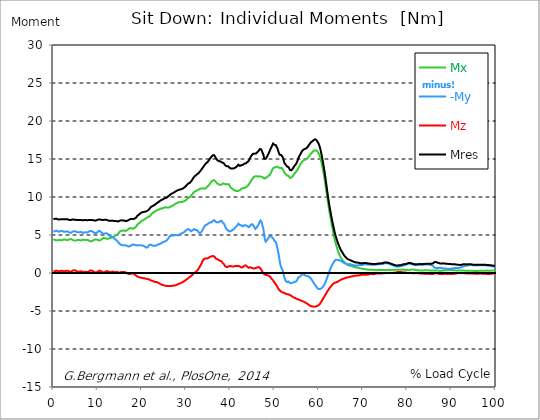
| Category |  Mx |  -My |  Mz |  Mres |
|---|---|---|---|---|
| 0.0 | 4.44 | 5.42 | 0.22 | 7.09 |
| 0.167348456675344 | 4.39 | 5.46 | 0.23 | 7.09 |
| 0.334696913350688 | 4.36 | 5.5 | 0.25 | 7.12 |
| 0.5020453700260321 | 4.33 | 5.54 | 0.29 | 7.14 |
| 0.669393826701376 | 4.29 | 5.58 | 0.32 | 7.15 |
| 0.83674228337672 | 4.29 | 5.53 | 0.3 | 7.09 |
| 1.0040907400520642 | 4.31 | 5.47 | 0.25 | 7.06 |
| 1.1621420602454444 | 4.36 | 5.43 | 0.2 | 7.04 |
| 1.3294905169207885 | 4.35 | 5.44 | 0.21 | 7.04 |
| 1.4968389735961325 | 4.33 | 5.47 | 0.23 | 7.05 |
| 1.6641874302714765 | 4.32 | 5.51 | 0.28 | 7.08 |
| 1.8315358869468206 | 4.29 | 5.54 | 0.33 | 7.1 |
| 1.9988843436221646 | 4.32 | 5.51 | 0.3 | 7.08 |
| 2.1662328002975086 | 4.36 | 5.46 | 0.27 | 7.07 |
| 2.333581256972853 | 4.41 | 5.43 | 0.22 | 7.07 |
| 2.5009297136481967 | 4.42 | 5.42 | 0.22 | 7.07 |
| 2.6682781703235405 | 4.4 | 5.43 | 0.24 | 7.07 |
| 2.8356266269988843 | 4.36 | 5.47 | 0.29 | 7.08 |
| 3.002975083674229 | 4.34 | 5.49 | 0.31 | 7.08 |
| 3.1703235403495724 | 4.34 | 5.47 | 0.31 | 7.07 |
| 3.337671997024917 | 4.34 | 5.44 | 0.29 | 7.04 |
| 3.4957233172182973 | 4.37 | 5.38 | 0.24 | 7 |
| 3.663071773893641 | 4.44 | 5.3 | 0.17 | 6.98 |
| 3.8304202305689854 | 4.48 | 5.27 | 0.15 | 6.97 |
| 3.997768687244329 | 4.47 | 5.29 | 0.17 | 6.98 |
| 4.165117143919673 | 4.43 | 5.36 | 0.23 | 7.02 |
| 4.332465600595017 | 4.36 | 5.45 | 0.31 | 7.05 |
| 4.499814057270361 | 4.29 | 5.5 | 0.36 | 7.05 |
| 4.667162513945706 | 4.27 | 5.49 | 0.36 | 7.02 |
| 4.834510970621049 | 4.28 | 5.47 | 0.34 | 7.02 |
| 5.001859427296393 | 4.26 | 5.5 | 0.34 | 7.02 |
| 5.169207883971737 | 4.27 | 5.45 | 0.29 | 6.99 |
| 5.336556340647081 | 4.32 | 5.37 | 0.21 | 6.96 |
| 5.503904797322425 | 4.35 | 5.36 | 0.17 | 6.97 |
| 5.671253253997769 | 4.36 | 5.35 | 0.15 | 6.97 |
| 5.82930457419115 | 4.36 | 5.35 | 0.15 | 6.97 |
| 5.996653030866494 | 4.33 | 5.38 | 0.19 | 6.99 |
| 6.164001487541838 | 4.29 | 5.41 | 0.24 | 6.99 |
| 6.331349944217181 | 4.28 | 5.39 | 0.23 | 6.97 |
| 6.498698400892526 | 4.32 | 5.33 | 0.18 | 6.94 |
| 6.66604685756787 | 4.4 | 5.26 | 0.12 | 6.93 |
| 6.833395314243213 | 4.39 | 5.3 | 0.13 | 6.94 |
| 7.000743770918558 | 4.36 | 5.35 | 0.16 | 6.97 |
| 7.168092227593902 | 4.34 | 5.38 | 0.19 | 6.98 |
| 7.335440684269246 | 4.34 | 5.36 | 0.17 | 6.96 |
| 7.50278914094459 | 4.35 | 5.33 | 0.13 | 6.94 |
| 7.6701375976199335 | 4.37 | 5.32 | 0.11 | 6.94 |
| 7.837486054295278 | 4.35 | 5.37 | 0.13 | 6.97 |
| 7.995537374488658 | 4.29 | 5.44 | 0.2 | 6.99 |
| 8.162885831164003 | 4.21 | 5.5 | 0.28 | 6.99 |
| 8.330234287839346 | 4.17 | 5.53 | 0.33 | 6.99 |
| 8.49758274451469 | 4.16 | 5.53 | 0.34 | 6.98 |
| 8.664931201190035 | 4.19 | 5.51 | 0.32 | 6.98 |
| 8.832279657865378 | 4.23 | 5.47 | 0.28 | 6.97 |
| 8.999628114540721 | 4.28 | 5.4 | 0.23 | 6.94 |
| 9.166976571216066 | 4.35 | 5.29 | 0.15 | 6.9 |
| 9.334325027891412 | 4.4 | 5.25 | 0.09 | 6.9 |
| 9.501673484566755 | 4.42 | 5.25 | 0.08 | 6.92 |
| 9.669021941242098 | 4.41 | 5.26 | 0.07 | 6.92 |
| 9.836370397917442 | 4.41 | 5.31 | 0.1 | 6.96 |
| 10.003718854592787 | 4.37 | 5.39 | 0.16 | 7 |
| 10.17106731126813 | 4.31 | 5.47 | 0.24 | 7.03 |
| 10.329118631461512 | 4.27 | 5.54 | 0.3 | 7.05 |
| 10.496467088136853 | 4.28 | 5.53 | 0.32 | 7.05 |
| 10.663815544812199 | 4.32 | 5.47 | 0.29 | 7.03 |
| 10.831164001487544 | 4.37 | 5.38 | 0.23 | 6.99 |
| 10.998512458162887 | 4.48 | 5.25 | 0.14 | 6.97 |
| 11.16586091483823 | 4.56 | 5.16 | 0.07 | 6.97 |
| 11.333209371513574 | 4.6 | 5.16 | 0.07 | 6.99 |
| 11.50055782818892 | 4.59 | 5.19 | 0.11 | 7.01 |
| 11.667906284864264 | 4.58 | 5.19 | 0.14 | 7.01 |
| 11.835254741539607 | 4.55 | 5.21 | 0.19 | 7.01 |
| 12.00260319821495 | 4.51 | 5.24 | 0.24 | 7.01 |
| 12.169951654890292 | 4.49 | 5.21 | 0.26 | 6.98 |
| 12.337300111565641 | 4.5 | 5.13 | 0.22 | 6.92 |
| 12.504648568240984 | 4.54 | 5.02 | 0.16 | 6.88 |
| 12.662699888434362 | 4.57 | 4.92 | 0.12 | 6.86 |
| 12.830048345109708 | 4.6 | 4.85 | 0.1 | 6.85 |
| 12.997396801785053 | 4.64 | 4.8 | 0.11 | 6.87 |
| 13.164745258460396 | 4.67 | 4.77 | 0.14 | 6.9 |
| 13.33209371513574 | 4.67 | 4.77 | 0.19 | 6.9 |
| 13.499442171811083 | 4.68 | 4.73 | 0.2 | 6.87 |
| 13.666790628486426 | 4.75 | 4.63 | 0.15 | 6.83 |
| 13.834139085161771 | 4.85 | 4.52 | 0.11 | 6.81 |
| 14.001487541837117 | 4.96 | 4.41 | 0.08 | 6.85 |
| 14.16883599851246 | 4.99 | 4.37 | 0.12 | 6.84 |
| 14.336184455187803 | 5.02 | 4.29 | 0.15 | 6.82 |
| 14.503532911863147 | 5.06 | 4.2 | 0.13 | 6.79 |
| 14.670881368538492 | 5.19 | 4.05 | 0.08 | 6.77 |
| 14.828932688731873 | 5.32 | 3.92 | 0.04 | 6.79 |
| 14.996281145407215 | 5.44 | 3.82 | 0.05 | 6.87 |
| 15.163629602082558 | 5.55 | 3.73 | 0.09 | 6.94 |
| 15.330978058757903 | 5.55 | 3.7 | 0.13 | 6.94 |
| 15.498326515433247 | 5.56 | 3.66 | 0.14 | 6.92 |
| 15.665674972108594 | 5.57 | 3.63 | 0.14 | 6.91 |
| 15.833023428783937 | 5.57 | 3.65 | 0.15 | 6.91 |
| 16.00037188545928 | 5.59 | 3.65 | 0.15 | 6.92 |
| 16.167720342134626 | 5.57 | 3.65 | 0.13 | 6.87 |
| 16.335068798809967 | 5.53 | 3.65 | 0.08 | 6.82 |
| 16.502417255485312 | 5.56 | 3.61 | 0.01 | 6.82 |
| 16.669765712160658 | 5.64 | 3.57 | -0.05 | 6.86 |
| 16.837114168836 | 5.69 | 3.55 | -0.08 | 6.9 |
| 17.004462625511344 | 5.79 | 3.49 | -0.13 | 6.96 |
| 17.16251394570472 | 5.86 | 3.5 | -0.13 | 7.02 |
| 17.32986240238007 | 5.92 | 3.51 | -0.13 | 7.08 |
| 17.497210859055414 | 5.93 | 3.58 | -0.11 | 7.12 |
| 17.664559315730756 | 5.88 | 3.69 | -0.06 | 7.13 |
| 17.8319077724061 | 5.82 | 3.74 | -0.05 | 7.1 |
| 17.999256229081443 | 5.81 | 3.75 | -0.07 | 7.09 |
| 18.166604685756788 | 5.88 | 3.72 | -0.11 | 7.12 |
| 18.333953142432133 | 5.92 | 3.71 | -0.16 | 7.15 |
| 18.501301599107478 | 5.98 | 3.67 | -0.23 | 7.19 |
| 18.668650055782823 | 6.07 | 3.66 | -0.32 | 7.26 |
| 18.835998512458165 | 6.22 | 3.64 | -0.41 | 7.39 |
| 19.00334696913351 | 6.38 | 3.63 | -0.48 | 7.54 |
| 19.170695425808855 | 6.48 | 3.64 | -0.51 | 7.63 |
| 19.338043882484197 | 6.52 | 3.65 | -0.54 | 7.67 |
| 19.496095202677576 | 6.6 | 3.64 | -0.59 | 7.75 |
| 19.66344365935292 | 6.7 | 3.65 | -0.61 | 7.85 |
| 19.830792116028263 | 6.79 | 3.66 | -0.62 | 7.93 |
| 19.998140572703612 | 6.86 | 3.63 | -0.63 | 7.97 |
| 20.165489029378953 | 6.92 | 3.61 | -0.65 | 8 |
| 20.3328374860543 | 6.97 | 3.59 | -0.67 | 8.03 |
| 20.500185942729644 | 7.03 | 3.54 | -0.69 | 8.05 |
| 20.667534399404985 | 7.08 | 3.49 | -0.7 | 8.06 |
| 20.83488285608033 | 7.16 | 3.41 | -0.74 | 8.08 |
| 21.002231312755672 | 7.23 | 3.34 | -0.77 | 8.11 |
| 21.16957976943102 | 7.29 | 3.34 | -0.78 | 8.14 |
| 21.336928226106362 | 7.35 | 3.39 | -0.79 | 8.22 |
| 21.504276682781704 | 7.34 | 3.57 | -0.8 | 8.28 |
| 21.67162513945705 | 7.39 | 3.69 | -0.85 | 8.39 |
| 21.82967645965043 | 7.51 | 3.73 | -0.92 | 8.53 |
| 21.997024916325774 | 7.62 | 3.71 | -0.97 | 8.63 |
| 22.16437337300112 | 7.73 | 3.7 | -1 | 8.73 |
| 22.33172182967646 | 7.84 | 3.68 | -1.03 | 8.8 |
| 22.499070286351806 | 7.93 | 3.57 | -1.07 | 8.83 |
| 22.666418743027148 | 8 | 3.56 | -1.09 | 8.89 |
| 22.833767199702496 | 8.03 | 3.57 | -1.13 | 8.94 |
| 23.00111565637784 | 8.09 | 3.55 | -1.19 | 8.99 |
| 23.168464113053183 | 8.17 | 3.58 | -1.2 | 9.08 |
| 23.335812569728528 | 8.22 | 3.65 | -1.2 | 9.16 |
| 23.50316102640387 | 8.26 | 3.71 | -1.23 | 9.23 |
| 23.670509483079215 | 8.3 | 3.74 | -1.27 | 9.29 |
| 23.83785793975456 | 8.33 | 3.78 | -1.33 | 9.35 |
| 23.995909259947936 | 8.39 | 3.83 | -1.39 | 9.44 |
| 24.163257716623285 | 8.45 | 3.84 | -1.46 | 9.52 |
| 24.330606173298627 | 8.49 | 3.9 | -1.49 | 9.59 |
| 24.49795462997397 | 8.49 | 3.96 | -1.52 | 9.62 |
| 24.665303086649313 | 8.5 | 4.02 | -1.57 | 9.66 |
| 24.83265154332466 | 8.53 | 4.08 | -1.6 | 9.72 |
| 25.0 | 8.59 | 4.12 | -1.63 | 9.79 |
| 25.167348456675345 | 8.62 | 4.15 | -1.65 | 9.84 |
| 25.334696913350694 | 8.64 | 4.18 | -1.67 | 9.88 |
| 25.502045370026035 | 8.62 | 4.22 | -1.69 | 9.88 |
| 25.669393826701377 | 8.62 | 4.32 | -1.7 | 9.94 |
| 25.836742283376722 | 8.62 | 4.43 | -1.71 | 10.01 |
| 26.004090740052067 | 8.6 | 4.57 | -1.7 | 10.06 |
| 26.17143919672741 | 8.63 | 4.73 | -1.7 | 10.18 |
| 26.329490516920792 | 8.67 | 4.83 | -1.7 | 10.27 |
| 26.49683897359613 | 8.72 | 4.89 | -1.71 | 10.34 |
| 26.66418743027148 | 8.78 | 4.94 | -1.72 | 10.42 |
| 26.831535886946828 | 8.84 | 4.93 | -1.7 | 10.46 |
| 26.998884343622166 | 8.87 | 4.93 | -1.67 | 10.48 |
| 27.166232800297514 | 8.95 | 4.93 | -1.66 | 10.55 |
| 27.333581256972852 | 9 | 4.95 | -1.64 | 10.62 |
| 27.5009297136482 | 9.08 | 4.98 | -1.62 | 10.69 |
| 27.668278170323543 | 9.14 | 5 | -1.62 | 10.75 |
| 27.835626626998888 | 9.19 | 5 | -1.58 | 10.8 |
| 28.002975083674233 | 9.22 | 4.98 | -1.52 | 10.83 |
| 28.170323540349575 | 9.29 | 4.96 | -1.46 | 10.9 |
| 28.33767199702492 | 9.33 | 5.01 | -1.42 | 10.97 |
| 28.50502045370026 | 9.31 | 5.05 | -1.39 | 10.96 |
| 28.663071773893645 | 9.32 | 5.1 | -1.38 | 11 |
| 28.830420230568986 | 9.31 | 5.18 | -1.33 | 11.01 |
| 28.99776868724433 | 9.33 | 5.23 | -1.26 | 11.05 |
| 29.165117143919673 | 9.36 | 5.25 | -1.23 | 11.08 |
| 29.33246560059502 | 9.4 | 5.29 | -1.18 | 11.13 |
| 29.499814057270367 | 9.44 | 5.35 | -1.11 | 11.2 |
| 29.66716251394571 | 9.47 | 5.45 | -1.03 | 11.28 |
| 29.834510970621054 | 9.51 | 5.53 | -0.95 | 11.36 |
| 30.00185942729639 | 9.59 | 5.59 | -0.9 | 11.46 |
| 30.169207883971744 | 9.7 | 5.67 | -0.85 | 11.59 |
| 30.33655634064708 | 9.8 | 5.76 | -0.76 | 11.71 |
| 30.50390479732243 | 9.83 | 5.79 | -0.67 | 11.76 |
| 30.671253253997772 | 9.9 | 5.73 | -0.6 | 11.81 |
| 30.829304574191156 | 9.97 | 5.67 | -0.52 | 11.86 |
| 30.996653030866494 | 10.08 | 5.55 | -0.46 | 11.94 |
| 31.164001487541842 | 10.19 | 5.49 | -0.36 | 12.06 |
| 31.331349944217187 | 10.31 | 5.52 | -0.3 | 12.19 |
| 31.498698400892525 | 10.44 | 5.63 | -0.21 | 12.36 |
| 31.666046857567874 | 10.55 | 5.74 | -0.08 | 12.53 |
| 31.833395314243212 | 10.65 | 5.78 | 0.01 | 12.67 |
| 32.00074377091856 | 10.73 | 5.74 | 0.06 | 12.77 |
| 32.1680922275939 | 10.78 | 5.66 | 0.13 | 12.83 |
| 32.33544068426925 | 10.81 | 5.72 | 0.2 | 12.94 |
| 32.50278914094459 | 10.87 | 5.64 | 0.3 | 13 |
| 32.670137597619934 | 10.93 | 5.53 | 0.41 | 13.07 |
| 32.83748605429528 | 10.99 | 5.35 | 0.54 | 13.14 |
| 33.004834510970625 | 11.02 | 5.23 | 0.73 | 13.24 |
| 33.162885831164004 | 11.07 | 5.26 | 0.89 | 13.37 |
| 33.33023428783935 | 11.12 | 5.32 | 1.05 | 13.51 |
| 33.497582744514695 | 11.14 | 5.42 | 1.25 | 13.64 |
| 33.664931201190036 | 11.13 | 5.55 | 1.49 | 13.76 |
| 33.83227965786538 | 11.1 | 5.77 | 1.7 | 13.9 |
| 33.99962811454073 | 11.13 | 5.95 | 1.83 | 14.04 |
| 34.16697657121607 | 11.1 | 6.13 | 1.88 | 14.18 |
| 34.33432502789141 | 11.1 | 6.28 | 1.93 | 14.31 |
| 34.50167348456676 | 11.21 | 6.35 | 1.93 | 14.43 |
| 34.6690219412421 | 11.27 | 6.35 | 1.87 | 14.46 |
| 34.83637039791744 | 11.37 | 6.41 | 1.9 | 14.57 |
| 35.00371885459279 | 11.46 | 6.5 | 1.96 | 14.69 |
| 35.17106731126814 | 11.56 | 6.59 | 2.03 | 14.84 |
| 35.338415767943474 | 11.68 | 6.64 | 2.12 | 14.99 |
| 35.49646708813686 | 11.82 | 6.62 | 2.15 | 15.12 |
| 35.6638155448122 | 11.96 | 6.64 | 2.19 | 15.25 |
| 35.831164001487544 | 12.08 | 6.72 | 2.21 | 15.37 |
| 35.998512458162885 | 12.17 | 6.82 | 2.23 | 15.47 |
| 36.165860914838234 | 12.25 | 6.93 | 2.24 | 15.57 |
| 36.333209371513576 | 12.21 | 6.95 | 2.2 | 15.52 |
| 36.50055782818892 | 12.14 | 6.9 | 2.11 | 15.4 |
| 36.667906284864266 | 12.04 | 6.76 | 1.94 | 15.2 |
| 36.83525474153961 | 11.92 | 6.65 | 1.87 | 15.03 |
| 37.002603198214956 | 11.8 | 6.66 | 1.83 | 14.9 |
| 37.1699516548903 | 11.71 | 6.7 | 1.8 | 14.8 |
| 37.337300111565646 | 11.69 | 6.67 | 1.74 | 14.75 |
| 37.50464856824098 | 11.66 | 6.7 | 1.68 | 14.72 |
| 37.66269988843437 | 11.6 | 6.8 | 1.61 | 14.67 |
| 37.83004834510971 | 11.61 | 6.84 | 1.6 | 14.66 |
| 37.99739680178505 | 11.61 | 6.88 | 1.54 | 14.65 |
| 38.16474525846039 | 11.7 | 6.72 | 1.4 | 14.54 |
| 38.33209371513574 | 11.78 | 6.61 | 1.31 | 14.5 |
| 38.49944217181109 | 11.78 | 6.54 | 1.21 | 14.46 |
| 38.666790628486424 | 11.74 | 6.4 | 1.06 | 14.33 |
| 38.83413908516178 | 11.68 | 6.13 | 0.91 | 14.18 |
| 39.001487541837115 | 11.68 | 5.91 | 0.81 | 14.09 |
| 39.16883599851246 | 11.67 | 5.76 | 0.78 | 14.05 |
| 39.336184455187805 | 11.68 | 5.66 | 0.8 | 14.03 |
| 39.503532911863154 | 11.7 | 5.6 | 0.83 | 14.05 |
| 39.670881368538495 | 11.69 | 5.51 | 0.85 | 14.01 |
| 39.83822982521384 | 11.51 | 5.46 | 0.91 | 13.86 |
| 39.996281145407224 | 11.36 | 5.44 | 0.91 | 13.76 |
| 40.163629602082565 | 11.21 | 5.52 | 0.9 | 13.74 |
| 40.33097805875791 | 11.1 | 5.61 | 0.88 | 13.73 |
| 40.498326515433256 | 11.07 | 5.66 | 0.85 | 13.76 |
| 40.6656749721086 | 11.03 | 5.72 | 0.85 | 13.79 |
| 40.83302342878393 | 10.93 | 5.78 | 0.87 | 13.77 |
| 41.00037188545929 | 10.87 | 5.9 | 0.92 | 13.82 |
| 41.16772034213463 | 10.82 | 6.01 | 0.93 | 13.88 |
| 41.33506879880997 | 10.77 | 6.09 | 0.93 | 13.94 |
| 41.50241725548531 | 10.78 | 6.2 | 0.93 | 14.03 |
| 41.66976571216066 | 10.77 | 6.25 | 0.91 | 14.07 |
| 41.837114168836 | 10.82 | 6.48 | 0.94 | 14.26 |
| 42.004462625511344 | 10.86 | 6.41 | 0.9 | 14.19 |
| 42.17181108218669 | 10.9 | 6.31 | 0.85 | 14.09 |
| 42.32986240238007 | 10.99 | 6.26 | 0.78 | 14.11 |
| 42.497210859055414 | 11.07 | 6.28 | 0.73 | 14.19 |
| 42.66455931573076 | 11.13 | 6.2 | 0.72 | 14.19 |
| 42.831907772406105 | 11.16 | 6.14 | 0.75 | 14.23 |
| 42.999256229081446 | 11.17 | 6.23 | 0.86 | 14.32 |
| 43.16660468575679 | 11.2 | 6.29 | 0.96 | 14.39 |
| 43.33395314243214 | 11.23 | 6.31 | 1.01 | 14.41 |
| 43.50130159910748 | 11.27 | 6.27 | 1 | 14.41 |
| 43.66865005578282 | 11.35 | 6.22 | 0.93 | 14.46 |
| 43.83599851245817 | 11.42 | 6.17 | 0.83 | 14.59 |
| 44.00334696913351 | 11.51 | 6.11 | 0.74 | 14.7 |
| 44.17069542580886 | 11.62 | 6.03 | 0.68 | 14.75 |
| 44.3380438824842 | 11.78 | 6 | 0.68 | 14.87 |
| 44.49609520267758 | 11.94 | 6.22 | 0.76 | 15.13 |
| 44.66344365935292 | 12.11 | 6.37 | 0.74 | 15.34 |
| 44.83079211602827 | 12.27 | 6.39 | 0.68 | 15.49 |
| 44.99814057270361 | 12.36 | 6.41 | 0.64 | 15.61 |
| 45.16548902937895 | 12.5 | 6.29 | 0.6 | 15.69 |
| 45.332837486054295 | 12.65 | 6.12 | 0.59 | 15.74 |
| 45.500185942729644 | 12.7 | 5.98 | 0.61 | 15.7 |
| 45.66753439940499 | 12.73 | 5.8 | 0.63 | 15.67 |
| 45.83488285608033 | 12.74 | 5.84 | 0.67 | 15.73 |
| 46.00223131275568 | 12.72 | 6.01 | 0.73 | 15.84 |
| 46.16957976943102 | 12.71 | 6.16 | 0.75 | 15.92 |
| 46.336928226106366 | 12.69 | 6.3 | 0.77 | 16 |
| 46.50427668278171 | 12.75 | 6.43 | 0.77 | 16.14 |
| 46.671625139457056 | 12.72 | 6.75 | 0.66 | 16.3 |
| 46.829676459650436 | 12.7 | 6.9 | 0.59 | 16.32 |
| 46.99702491632577 | 12.68 | 6.8 | 0.45 | 16.27 |
| 47.16437337300112 | 12.68 | 6.56 | 0.26 | 16.14 |
| 47.33172182967646 | 12.61 | 6.1 | 0.08 | 15.77 |
| 47.49907028635181 | 12.6 | 5.8 | 0 | 15.55 |
| 47.66641874302716 | 12.44 | 4.92 | -0.16 | 15.03 |
| 47.83376719970249 | 12.41 | 4.41 | -0.23 | 14.94 |
| 48.001115656377834 | 12.48 | 4.13 | -0.25 | 15.03 |
| 48.16846411305319 | 12.57 | 4.12 | -0.27 | 15.14 |
| 48.33581256972853 | 12.65 | 4.35 | -0.27 | 15.34 |
| 48.50316102640387 | 12.71 | 4.5 | -0.3 | 15.54 |
| 48.67050948307921 | 12.79 | 4.58 | -0.36 | 15.73 |
| 48.837857939754564 | 12.89 | 4.77 | -0.41 | 15.95 |
| 49.005206396429905 | 12.99 | 4.88 | -0.48 | 16.18 |
| 49.163257716623285 | 13.15 | 4.85 | -0.59 | 16.41 |
| 49.33060617329863 | 13.37 | 4.74 | -0.76 | 16.6 |
| 49.49795462997397 | 13.6 | 4.68 | -0.89 | 16.81 |
| 49.66530308664932 | 13.79 | 4.67 | -0.97 | 17.03 |
| 49.832651543324666 | 13.89 | 4.41 | -1.07 | 17 |
| 50.0 | 13.88 | 4.21 | -1.25 | 16.86 |
| 50.16734845667534 | 13.92 | 4.18 | -1.38 | 16.86 |
| 50.33469691335069 | 13.95 | 4.06 | -1.51 | 16.81 |
| 50.50204537002604 | 13.95 | 3.65 | -1.68 | 16.58 |
| 50.66939382670139 | 13.98 | 3.26 | -1.83 | 16.4 |
| 50.836742283376715 | 13.92 | 2.73 | -2.03 | 16.08 |
| 51.00409074005207 | 13.87 | 2.26 | -2.16 | 15.79 |
| 51.17143919672741 | 13.8 | 1.59 | -2.28 | 15.57 |
| 51.32949051692079 | 13.8 | 1.05 | -2.38 | 15.51 |
| 51.496838973596134 | 13.85 | 0.78 | -2.46 | 15.52 |
| 51.66418743027148 | 13.82 | 0.57 | -2.51 | 15.4 |
| 51.831535886946824 | 13.72 | 0.38 | -2.55 | 15.28 |
| 51.99888434362217 | 13.53 | 0.02 | -2.59 | 14.99 |
| 52.16623280029752 | 13.28 | -0.42 | -2.62 | 14.62 |
| 52.33358125697285 | 13.11 | -0.73 | -2.66 | 14.39 |
| 52.5009297136482 | 13.03 | -1.03 | -2.72 | 14.26 |
| 52.668278170323546 | 12.96 | -1.12 | -2.74 | 14.16 |
| 52.835626626998895 | 12.82 | -1.19 | -2.77 | 14.01 |
| 53.00297508367424 | 12.79 | -1.16 | -2.8 | 13.96 |
| 53.17032354034958 | 12.8 | -1.11 | -2.83 | 13.94 |
| 53.33767199702492 | 12.66 | -1.22 | -2.87 | 13.74 |
| 53.50502045370027 | 12.51 | -1.31 | -2.9 | 13.55 |
| 53.663071773893655 | 12.51 | -1.35 | -2.97 | 13.51 |
| 53.83042023056899 | 12.55 | -1.34 | -3.03 | 13.52 |
| 53.99776868724433 | 12.63 | -1.27 | -3.11 | 13.61 |
| 54.16511714391967 | 12.77 | -1.25 | -3.16 | 13.77 |
| 54.33246560059503 | 12.91 | -1.23 | -3.22 | 13.93 |
| 54.49981405727037 | 13.06 | -1.18 | -3.26 | 14.08 |
| 54.667162513945705 | 13.18 | -1.1 | -3.29 | 14.21 |
| 54.834510970621054 | 13.27 | -1.12 | -3.35 | 14.33 |
| 55.0018594272964 | 13.39 | -1.09 | -3.41 | 14.48 |
| 55.169207883971744 | 13.56 | -0.9 | -3.44 | 14.7 |
| 55.336556340647086 | 13.73 | -0.61 | -3.45 | 14.99 |
| 55.50390479732243 | 13.93 | -0.57 | -3.51 | 15.24 |
| 55.671253253997776 | 14.11 | -0.52 | -3.56 | 15.43 |
| 55.83860171067312 | 14.27 | -0.4 | -3.59 | 15.61 |
| 55.9966530308665 | 14.43 | -0.31 | -3.63 | 15.8 |
| 56.16400148754184 | 14.58 | -0.25 | -3.67 | 15.97 |
| 56.33134994421718 | 14.7 | -0.17 | -3.71 | 16.1 |
| 56.498698400892536 | 14.81 | -0.17 | -3.74 | 16.21 |
| 56.66604685756788 | 14.86 | -0.19 | -3.78 | 16.27 |
| 56.83339531424321 | 14.9 | -0.27 | -3.84 | 16.31 |
| 57.00074377091856 | 14.93 | -0.35 | -3.9 | 16.35 |
| 57.16809222759391 | 14.98 | -0.41 | -3.96 | 16.4 |
| 57.33544068426925 | 15.04 | -0.4 | -4.01 | 16.49 |
| 57.5027891409446 | 15.12 | -0.39 | -4.07 | 16.58 |
| 57.670137597619934 | 15.24 | -0.43 | -4.14 | 16.71 |
| 57.83748605429528 | 15.39 | -0.51 | -4.23 | 16.89 |
| 58.004834510970625 | 15.52 | -0.59 | -4.3 | 17.01 |
| 58.16288583116401 | 15.65 | -0.71 | -4.36 | 17.15 |
| 58.330234287839346 | 15.77 | -0.8 | -4.38 | 17.25 |
| 58.497582744514695 | 15.85 | -0.96 | -4.4 | 17.32 |
| 58.66493120119004 | 15.94 | -1.12 | -4.42 | 17.4 |
| 58.832279657865385 | 16.04 | -1.19 | -4.41 | 17.48 |
| 58.999628114540734 | 16.13 | -1.41 | -4.44 | 17.57 |
| 59.16697657121607 | 16.16 | -1.55 | -4.44 | 17.6 |
| 59.33432502789142 | 16.14 | -1.68 | -4.4 | 17.56 |
| 59.50167348456676 | 16.1 | -1.81 | -4.37 | 17.48 |
| 59.66902194124211 | 16.02 | -1.99 | -4.34 | 17.32 |
| 59.83637039791745 | 15.89 | -2.08 | -4.29 | 17.17 |
| 60.00371885459278 | 15.71 | -2.12 | -4.23 | 16.99 |
| 60.17106731126813 | 15.48 | -2.14 | -4.14 | 16.72 |
| 60.33841576794349 | 15.21 | -2.12 | -4.01 | 16.4 |
| 60.49646708813685 | 14.83 | -2.06 | -3.86 | 15.96 |
| 60.6638155448122 | 14.42 | -1.99 | -3.7 | 15.51 |
| 60.831164001487544 | 13.96 | -1.89 | -3.52 | 15 |
| 60.99851245816289 | 13.46 | -1.77 | -3.35 | 14.45 |
| 61.16586091483824 | 12.91 | -1.62 | -3.2 | 13.86 |
| 61.333209371513576 | 12.32 | -1.46 | -3.04 | 13.24 |
| 61.50055782818892 | 11.67 | -1.24 | -2.87 | 12.56 |
| 61.667906284864266 | 11 | -1 | -2.71 | 11.86 |
| 61.835254741539615 | 10.33 | -0.74 | -2.55 | 11.16 |
| 62.002603198214956 | 9.67 | -0.45 | -2.38 | 10.45 |
| 62.16995165489029 | 9.02 | -0.18 | -2.24 | 9.77 |
| 62.33730011156564 | 8.4 | 0.08 | -2.09 | 9.14 |
| 62.504648568240995 | 7.83 | 0.35 | -1.96 | 8.56 |
| 62.67199702491633 | 7.3 | 0.59 | -1.83 | 8.04 |
| 62.83004834510971 | 6.75 | 0.81 | -1.7 | 7.51 |
| 62.99739680178505 | 6.21 | 1.01 | -1.58 | 7 |
| 63.1647452584604 | 5.69 | 1.19 | -1.47 | 6.53 |
| 63.33209371513575 | 5.19 | 1.36 | -1.4 | 6.08 |
| 63.4994421718111 | 4.71 | 1.54 | -1.33 | 5.62 |
| 63.666790628486424 | 4.27 | 1.67 | -1.27 | 5.21 |
| 63.83413908516177 | 3.89 | 1.73 | -1.24 | 4.86 |
| 64.00148754183712 | 3.56 | 1.74 | -1.22 | 4.55 |
| 64.16883599851248 | 3.25 | 1.73 | -1.2 | 4.26 |
| 64.3361844551878 | 2.94 | 1.72 | -1.14 | 3.96 |
| 64.50353291186315 | 2.66 | 1.7 | -1.07 | 3.7 |
| 64.6708813685385 | 2.4 | 1.71 | -0.99 | 3.46 |
| 64.83822982521384 | 2.21 | 1.62 | -0.95 | 3.24 |
| 65.00557828188919 | 2.03 | 1.58 | -0.9 | 3.05 |
| 65.16362960208257 | 1.85 | 1.56 | -0.85 | 2.88 |
| 65.3309780587579 | 1.7 | 1.51 | -0.81 | 2.72 |
| 65.49832651543326 | 1.63 | 1.39 | -0.78 | 2.55 |
| 65.6656749721086 | 1.52 | 1.33 | -0.73 | 2.39 |
| 65.83302342878395 | 1.4 | 1.3 | -0.68 | 2.25 |
| 66.00037188545929 | 1.3 | 1.25 | -0.66 | 2.14 |
| 66.16772034213463 | 1.21 | 1.22 | -0.62 | 2.03 |
| 66.33506879880998 | 1.13 | 1.18 | -0.6 | 1.93 |
| 66.50241725548531 | 1.07 | 1.14 | -0.59 | 1.85 |
| 66.66976571216065 | 1.02 | 1.16 | -0.57 | 1.81 |
| 66.83711416883601 | 0.99 | 1.17 | -0.55 | 1.76 |
| 67.00446262551135 | 0.97 | 1.16 | -0.52 | 1.72 |
| 67.1718110821867 | 0.95 | 1.15 | -0.49 | 1.68 |
| 67.32986240238007 | 0.93 | 1.12 | -0.47 | 1.64 |
| 67.49721085905541 | 0.9 | 1.09 | -0.45 | 1.59 |
| 67.66455931573076 | 0.87 | 1.06 | -0.43 | 1.54 |
| 67.83190777240611 | 0.84 | 1.03 | -0.39 | 1.5 |
| 67.99925622908145 | 0.8 | 1 | -0.37 | 1.46 |
| 68.16660468575678 | 0.77 | 0.99 | -0.36 | 1.42 |
| 68.33395314243214 | 0.74 | 1 | -0.35 | 1.4 |
| 68.50130159910749 | 0.73 | 0.99 | -0.34 | 1.38 |
| 68.66865005578282 | 0.72 | 0.99 | -0.33 | 1.37 |
| 68.83599851245816 | 0.7 | 1 | -0.32 | 1.37 |
| 69.00334696913352 | 0.68 | 1.03 | -0.32 | 1.35 |
| 69.17069542580886 | 0.66 | 1.04 | -0.29 | 1.33 |
| 69.3380438824842 | 0.63 | 1.05 | -0.27 | 1.31 |
| 69.50539233915956 | 0.6 | 1.04 | -0.24 | 1.28 |
| 69.66344365935292 | 0.58 | 1.03 | -0.23 | 1.26 |
| 69.83079211602826 | 0.56 | 1.05 | -0.23 | 1.27 |
| 69.99814057270362 | 0.54 | 1.08 | -0.22 | 1.28 |
| 70.16548902937896 | 0.52 | 1.11 | -0.22 | 1.3 |
| 70.33283748605429 | 0.51 | 1.14 | -0.23 | 1.32 |
| 70.50018594272964 | 0.49 | 1.16 | -0.22 | 1.33 |
| 70.667534399405 | 0.48 | 1.15 | -0.23 | 1.32 |
| 70.83488285608033 | 0.48 | 1.12 | -0.23 | 1.29 |
| 71.00223131275568 | 0.46 | 1.12 | -0.22 | 1.27 |
| 71.16957976943102 | 0.43 | 1.12 | -0.2 | 1.26 |
| 71.33692822610637 | 0.43 | 1.12 | -0.18 | 1.25 |
| 71.50427668278171 | 0.43 | 1.11 | -0.16 | 1.24 |
| 71.67162513945706 | 0.42 | 1.1 | -0.14 | 1.23 |
| 71.8389735961324 | 0.42 | 1.09 | -0.13 | 1.21 |
| 71.99702491632577 | 0.42 | 1.08 | -0.13 | 1.2 |
| 72.16437337300113 | 0.41 | 1.07 | -0.15 | 1.19 |
| 72.33172182967647 | 0.4 | 1.06 | -0.16 | 1.17 |
| 72.49907028635181 | 0.39 | 1.07 | -0.15 | 1.18 |
| 72.66641874302715 | 0.38 | 1.08 | -0.12 | 1.17 |
| 72.8337671997025 | 0.34 | 1.1 | -0.09 | 1.18 |
| 73.00111565637783 | 0.36 | 1.1 | -0.08 | 1.2 |
| 73.16846411305319 | 0.38 | 1.11 | -0.06 | 1.21 |
| 73.33581256972853 | 0.39 | 1.13 | -0.05 | 1.23 |
| 73.50316102640387 | 0.4 | 1.15 | -0.04 | 1.25 |
| 73.67050948307921 | 0.41 | 1.15 | -0.05 | 1.26 |
| 73.83785793975457 | 0.4 | 1.15 | -0.06 | 1.26 |
| 74.00520639642991 | 0.4 | 1.16 | -0.07 | 1.26 |
| 74.16325771662328 | 0.4 | 1.18 | -0.06 | 1.28 |
| 74.33060617329863 | 0.4 | 1.2 | -0.05 | 1.3 |
| 74.49795462997398 | 0.4 | 1.19 | -0.04 | 1.29 |
| 74.66530308664932 | 0.39 | 1.25 | -0.03 | 1.35 |
| 74.83265154332466 | 0.4 | 1.28 | -0.02 | 1.38 |
| 75.00000000000001 | 0.41 | 1.26 | -0.02 | 1.36 |
| 75.16734845667534 | 0.39 | 1.29 | -0.01 | 1.39 |
| 75.3346969133507 | 0.4 | 1.29 | 0 | 1.39 |
| 75.50204537002605 | 0.41 | 1.28 | -0.01 | 1.38 |
| 75.66939382670138 | 0.42 | 1.27 | -0.02 | 1.37 |
| 75.83674228337672 | 0.41 | 1.23 | -0.01 | 1.33 |
| 76.00409074005208 | 0.41 | 1.19 | 0 | 1.3 |
| 76.17143919672742 | 0.41 | 1.15 | 0.02 | 1.26 |
| 76.33878765340276 | 0.4 | 1.11 | 0.02 | 1.22 |
| 76.49683897359614 | 0.39 | 1.07 | 0.01 | 1.18 |
| 76.66418743027148 | 0.42 | 1.04 | 0 | 1.17 |
| 76.83153588694682 | 0.4 | 1 | 0.02 | 1.12 |
| 76.99888434362218 | 0.4 | 0.95 | 0.05 | 1.07 |
| 77.16623280029752 | 0.41 | 0.9 | 0.05 | 1.04 |
| 77.33358125697285 | 0.42 | 0.87 | 0.04 | 1.02 |
| 77.5009297136482 | 0.41 | 0.86 | 0.09 | 1 |
| 77.66827817032356 | 0.43 | 0.85 | 0.11 | 1 |
| 77.83562662699889 | 0.43 | 0.84 | 0.13 | 1 |
| 78.00297508367423 | 0.43 | 0.86 | 0.13 | 1.01 |
| 78.17032354034959 | 0.43 | 0.86 | 0.13 | 1.01 |
| 78.33767199702493 | 0.44 | 0.86 | 0.13 | 1 |
| 78.50502045370027 | 0.44 | 0.88 | 0.12 | 1.02 |
| 78.67236891037561 | 0.44 | 0.92 | 0.12 | 1.06 |
| 78.83042023056899 | 0.45 | 0.94 | 0.11 | 1.1 |
| 78.99776868724433 | 0.46 | 0.97 | 0.1 | 1.13 |
| 79.16511714391969 | 0.46 | 0.99 | 0.09 | 1.15 |
| 79.33246560059503 | 0.43 | 1.03 | 0.07 | 1.15 |
| 79.49981405727036 | 0.4 | 1.06 | 0.06 | 1.16 |
| 79.66716251394571 | 0.4 | 1.08 | 0.05 | 1.17 |
| 79.83451097062107 | 0.41 | 1.11 | 0.03 | 1.2 |
| 80.00185942729641 | 0.39 | 1.15 | 0.01 | 1.23 |
| 80.16920788397174 | 0.37 | 1.2 | 0.01 | 1.29 |
| 80.33655634064709 | 0.36 | 1.25 | 0.01 | 1.34 |
| 80.50390479732243 | 0.4 | 1.24 | 0.01 | 1.33 |
| 80.67125325399778 | 0.42 | 1.23 | 0 | 1.32 |
| 80.83860171067312 | 0.43 | 1.2 | -0.01 | 1.29 |
| 80.99665303086651 | 0.45 | 1.16 | -0.01 | 1.26 |
| 81.16400148754184 | 0.45 | 1.12 | -0.02 | 1.23 |
| 81.3313499442172 | 0.45 | 1.08 | -0.04 | 1.19 |
| 81.49869840089255 | 0.44 | 1.07 | -0.04 | 1.18 |
| 81.66604685756786 | 0.43 | 1.04 | -0.03 | 1.15 |
| 81.83339531424322 | 0.43 | 1.03 | -0.03 | 1.14 |
| 82.00074377091858 | 0.4 | 1.05 | -0.01 | 1.15 |
| 82.16809222759392 | 0.39 | 1.05 | -0.02 | 1.15 |
| 82.33544068426926 | 0.38 | 1.06 | -0.02 | 1.15 |
| 82.50278914094459 | 0.37 | 1.07 | -0.02 | 1.16 |
| 82.67013759761994 | 0.34 | 1.08 | -0.04 | 1.16 |
| 82.83748605429528 | 0.34 | 1.11 | -0.05 | 1.18 |
| 83.00483451097062 | 0.34 | 1.1 | -0.06 | 1.17 |
| 83.17218296764597 | 0.35 | 1.09 | -0.08 | 1.16 |
| 83.33023428783935 | 0.33 | 1.09 | -0.07 | 1.16 |
| 83.4975827445147 | 0.34 | 1.1 | -0.07 | 1.18 |
| 83.66493120119004 | 0.34 | 1.1 | -0.08 | 1.18 |
| 83.83227965786537 | 0.34 | 1.1 | -0.09 | 1.18 |
| 83.99962811454073 | 0.35 | 1.11 | -0.1 | 1.19 |
| 84.16697657121607 | 0.35 | 1.12 | -0.09 | 1.2 |
| 84.33432502789142 | 0.37 | 1.11 | -0.11 | 1.21 |
| 84.50167348456677 | 0.37 | 1.12 | -0.09 | 1.22 |
| 84.6690219412421 | 0.37 | 1.13 | -0.09 | 1.23 |
| 84.83637039791745 | 0.36 | 1.14 | -0.1 | 1.23 |
| 85.0037188545928 | 0.34 | 1.12 | -0.11 | 1.23 |
| 85.17106731126813 | 0.33 | 1.09 | -0.12 | 1.22 |
| 85.33841576794349 | 0.34 | 1.03 | -0.13 | 1.22 |
| 85.50576422461883 | 0.31 | 1.01 | -0.13 | 1.23 |
| 85.66381554481221 | 0.32 | 0.97 | -0.13 | 1.23 |
| 85.83116400148755 | 0.33 | 0.93 | -0.13 | 1.25 |
| 85.99851245816289 | 0.33 | 0.86 | -0.1 | 1.3 |
| 86.16586091483823 | 0.34 | 0.72 | -0.07 | 1.43 |
| 86.33320937151358 | 0.34 | 0.65 | -0.05 | 1.47 |
| 86.50055782818893 | 0.34 | 0.65 | -0.04 | 1.44 |
| 86.66790628486427 | 0.32 | 0.65 | -0.04 | 1.39 |
| 86.83525474153961 | 0.32 | 0.65 | -0.05 | 1.37 |
| 87.00260319821496 | 0.33 | 0.65 | -0.06 | 1.35 |
| 87.16995165489031 | 0.31 | 0.66 | -0.09 | 1.31 |
| 87.33730011156564 | 0.28 | 0.71 | -0.12 | 1.25 |
| 87.504648568241 | 0.28 | 0.7 | -0.13 | 1.24 |
| 87.67199702491634 | 0.29 | 0.66 | -0.14 | 1.24 |
| 87.83004834510972 | 0.29 | 0.64 | -0.13 | 1.25 |
| 87.99739680178506 | 0.32 | 0.62 | -0.13 | 1.26 |
| 88.1647452584604 | 0.34 | 0.6 | -0.13 | 1.27 |
| 88.33209371513574 | 0.34 | 0.61 | -0.11 | 1.26 |
| 88.49944217181108 | 0.35 | 0.61 | -0.09 | 1.25 |
| 88.66679062848644 | 0.36 | 0.59 | -0.1 | 1.23 |
| 88.83413908516178 | 0.36 | 0.56 | -0.1 | 1.21 |
| 89.00148754183712 | 0.37 | 0.54 | -0.12 | 1.21 |
| 89.16883599851246 | 0.37 | 0.54 | -0.12 | 1.2 |
| 89.33618445518782 | 0.37 | 0.55 | -0.11 | 1.19 |
| 89.50353291186315 | 0.38 | 0.55 | -0.11 | 1.18 |
| 89.6708813685385 | 0.39 | 0.55 | -0.12 | 1.18 |
| 89.83822982521386 | 0.39 | 0.55 | -0.12 | 1.17 |
| 90.00557828188919 | 0.4 | 0.57 | -0.13 | 1.16 |
| 90.16362960208257 | 0.4 | 0.58 | -0.12 | 1.15 |
| 90.3309780587579 | 0.39 | 0.6 | -0.1 | 1.16 |
| 90.49832651543326 | 0.39 | 0.61 | -0.1 | 1.16 |
| 90.66567497210859 | 0.35 | 0.66 | -0.09 | 1.14 |
| 90.83302342878395 | 0.35 | 0.67 | -0.09 | 1.14 |
| 91.00037188545929 | 0.34 | 0.68 | -0.07 | 1.13 |
| 91.16772034213463 | 0.33 | 0.67 | -0.05 | 1.11 |
| 91.33506879880998 | 0.33 | 0.66 | -0.04 | 1.09 |
| 91.50241725548533 | 0.32 | 0.66 | -0.02 | 1.08 |
| 91.66976571216065 | 0.32 | 0.67 | 0 | 1.07 |
| 91.83711416883601 | 0.33 | 0.69 | -0.01 | 1.07 |
| 92.00446262551137 | 0.34 | 0.71 | -0.02 | 1.07 |
| 92.1718110821867 | 0.35 | 0.73 | -0.02 | 1.06 |
| 92.33915953886203 | 0.34 | 0.77 | -0.01 | 1.09 |
| 92.49721085905541 | 0.34 | 0.81 | 0 | 1.12 |
| 92.66455931573077 | 0.34 | 0.85 | -0.01 | 1.13 |
| 92.83190777240611 | 0.32 | 0.89 | -0.02 | 1.15 |
| 92.99925622908145 | 0.31 | 0.93 | -0.04 | 1.15 |
| 93.1666046857568 | 0.3 | 0.95 | -0.04 | 1.15 |
| 93.33395314243214 | 0.31 | 0.95 | -0.05 | 1.14 |
| 93.50130159910749 | 0.32 | 0.95 | -0.06 | 1.13 |
| 93.66865005578283 | 0.31 | 0.97 | -0.06 | 1.13 |
| 93.83599851245818 | 0.32 | 1 | -0.05 | 1.14 |
| 94.00334696913353 | 0.31 | 1.03 | -0.06 | 1.15 |
| 94.17069542580886 | 0.31 | 1.05 | -0.06 | 1.16 |
| 94.3380438824842 | 0.3 | 1.06 | -0.06 | 1.16 |
| 94.50539233915954 | 0.29 | 1.05 | -0.07 | 1.14 |
| 94.66344365935292 | 0.29 | 1.03 | -0.07 | 1.12 |
| 94.83079211602828 | 0.27 | 1.02 | -0.07 | 1.1 |
| 94.99814057270362 | 0.27 | 1.01 | -0.07 | 1.09 |
| 95.16548902937897 | 0.27 | 1.01 | -0.07 | 1.09 |
| 95.33283748605432 | 0.27 | 1.01 | -0.09 | 1.1 |
| 95.50018594272963 | 0.27 | 1.01 | -0.11 | 1.1 |
| 95.66753439940499 | 0.27 | 1.01 | -0.12 | 1.09 |
| 95.83488285608034 | 0.26 | 1 | -0.11 | 1.08 |
| 96.00223131275567 | 0.26 | 1.02 | -0.1 | 1.09 |
| 96.16957976943102 | 0.26 | 1.03 | -0.1 | 1.1 |
| 96.33692822610638 | 0.29 | 1.02 | -0.08 | 1.1 |
| 96.50427668278171 | 0.28 | 1.03 | -0.07 | 1.1 |
| 96.67162513945706 | 0.28 | 1.03 | -0.07 | 1.11 |
| 96.8389735961324 | 0.3 | 1.02 | -0.07 | 1.09 |
| 96.99702491632577 | 0.3 | 1.01 | -0.09 | 1.08 |
| 97.16437337300111 | 0.3 | 1.01 | -0.09 | 1.09 |
| 97.33172182967647 | 0.29 | 1.02 | -0.09 | 1.1 |
| 97.49907028635181 | 0.28 | 1.02 | -0.09 | 1.09 |
| 97.66641874302715 | 0.28 | 1.02 | -0.09 | 1.08 |
| 97.8337671997025 | 0.3 | 1 | -0.1 | 1.07 |
| 98.00111565637785 | 0.33 | 0.98 | -0.13 | 1.07 |
| 98.16846411305319 | 0.28 | 0.97 | -0.13 | 1.06 |
| 98.33581256972855 | 0.29 | 0.96 | -0.13 | 1.05 |
| 98.50316102640389 | 0.29 | 0.95 | -0.13 | 1.04 |
| 98.67050948307921 | 0.28 | 0.95 | -0.13 | 1.03 |
| 98.83785793975456 | 0.31 | 0.93 | -0.12 | 1.02 |
| 99.0052063964299 | 0.31 | 0.92 | -0.09 | 1 |
| 99.17255485310525 | 0.32 | 0.9 | -0.09 | 0.99 |
| 99.33060617329863 | 0.32 | 0.88 | -0.08 | 0.97 |
| 99.49795462997399 | 0.32 | 0.87 | -0.07 | 0.96 |
| 99.66530308664933 | 0.33 | 0.85 | -0.06 | 0.95 |
| 99.83265154332467 | 0.36 | 0.83 | -0.07 | 0.95 |
| 100.0 | 0.37 | 0.81 | -0.07 | 0.93 |